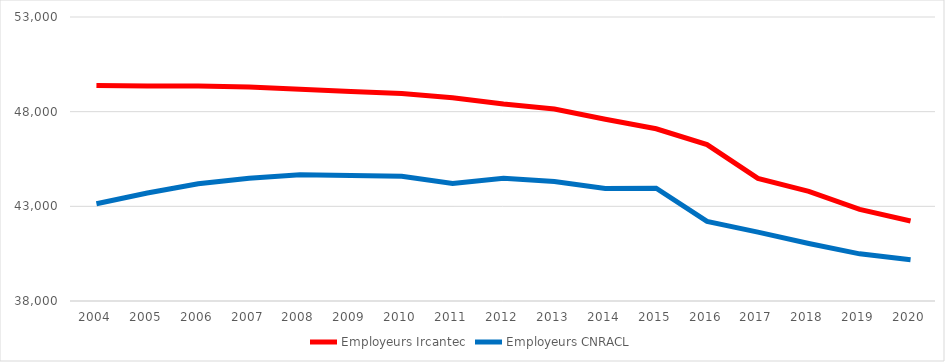
| Category | Employeurs Ircantec | Employeurs CNRACL |
|---|---|---|
| 2004.0 | 49384 | 43140 |
| 2005.0 | 49357 | 43701 |
| 2006.0 | 49357 | 44190 |
| 2007.0 | 49304 | 44489 |
| 2008.0 | 49189 | 44670 |
| 2009.0 | 49070 | 44624 |
| 2010.0 | 48960 | 44587 |
| 2011.0 | 48738 | 44205 |
| 2012.0 | 48405 | 44479 |
| 2013.0 | 48140 | 44306 |
| 2014.0 | 47599 | 43941 |
| 2015.0 | 47095 | 43959 |
| 2016.0 | 46258 | 42207 |
| 2017.0 | 44477 | 41635 |
| 2018.0 | 43793 | 41038 |
| 2019.0 | 42835 | 40490 |
| 2020.0 | 42226 | 40183 |